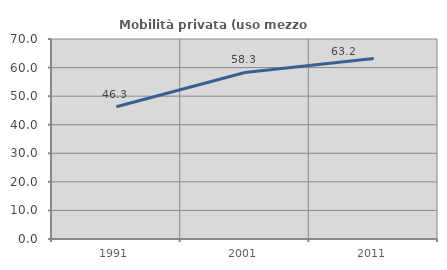
| Category | Mobilità privata (uso mezzo privato) |
|---|---|
| 1991.0 | 46.302 |
| 2001.0 | 58.301 |
| 2011.0 | 63.189 |